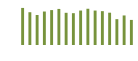
| Category | Saldo [ (1)-(2) ] |
|---|---|
| 0 | 329612.931 |
| 1 | 291358.085 |
| 2 | 266512.131 |
| 3 | 297562.723 |
| 4 | 310243.352 |
| 5 | 320714.531 |
| 6 | 286229.119 |
| 7 | 282809.198 |
| 8 | 306315.684 |
| 9 | 322195.815 |
| 10 | 306185.726 |
| 11 | 300797.708 |
| 12 | 287185.489 |
| 13 | 229607.519 |
| 14 | 262635.545 |
| 15 | 222974.622 |